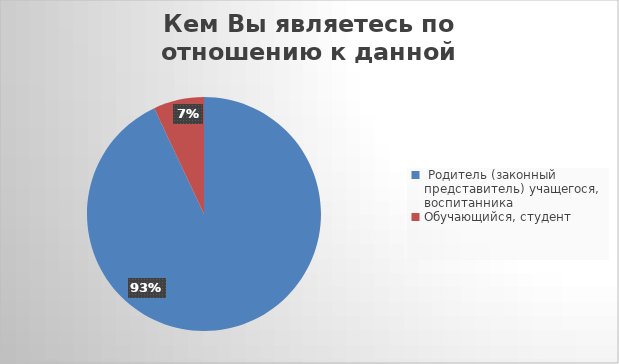
| Category | Series 0 |
|---|---|
|  Родитель (законный представитель) учащегося, воспитанника | 0.93 |
| Обучающийся, студент | 0.07 |